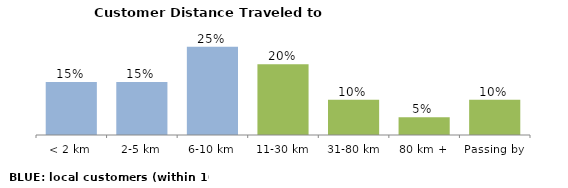
| Category | Series 0 |
|---|---|
| < 2 km | 0.15 |
| 2-5 km | 0.15 |
| 6-10 km | 0.25 |
| 11-30 km | 0.2 |
| 31-80 km | 0.1 |
| 80 km + | 0.05 |
| Passing by | 0.1 |